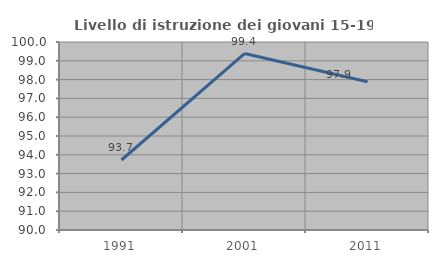
| Category | Livello di istruzione dei giovani 15-19 anni |
|---|---|
| 1991.0 | 93.724 |
| 2001.0 | 99.387 |
| 2011.0 | 97.887 |